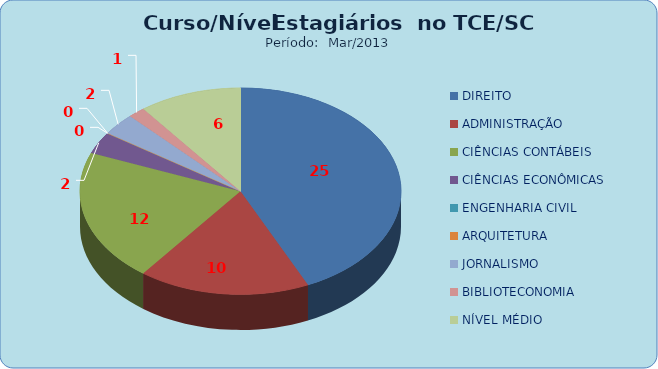
| Category | Series 0 |
|---|---|
| DIREITO | 25 |
| ADMINISTRAÇÃO | 10 |
| CIÊNCIAS CONTÁBEIS | 12 |
| CIÊNCIAS ECONÔMICAS | 2 |
| ENGENHARIA CIVIL | 0 |
| ARQUITETURA | 0 |
| JORNALISMO | 2 |
| BIBLIOTECONOMIA | 1 |
| NÍVEL MÉDIO | 6 |